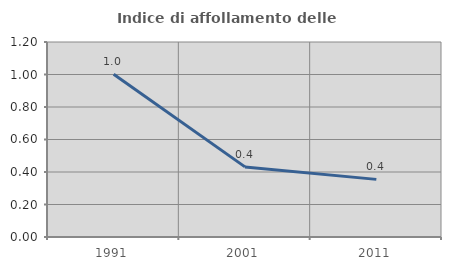
| Category | Indice di affollamento delle abitazioni  |
|---|---|
| 1991.0 | 1.002 |
| 2001.0 | 0.431 |
| 2011.0 | 0.355 |